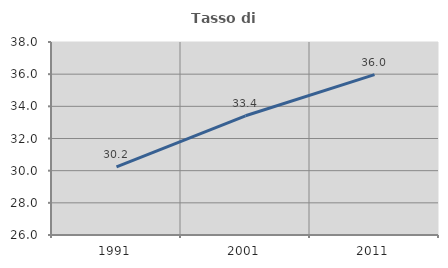
| Category | Tasso di occupazione   |
|---|---|
| 1991.0 | 30.231 |
| 2001.0 | 33.412 |
| 2011.0 | 35.969 |